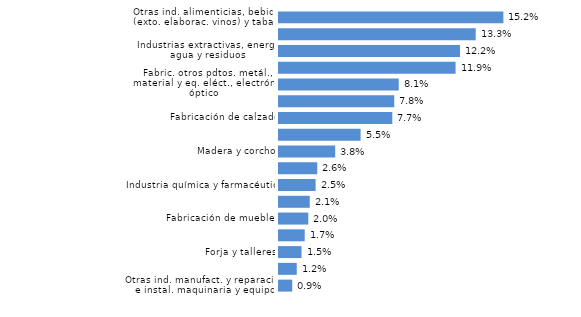
| Category | La Rioja |
|---|---|
| Otras ind. manufact. y reparación e instal. maquinaria y equipo | 0.009 |
| Metalurgia y fabricación de elementos metálicos para la construcción | 0.012 |
| Forja y talleres | 0.015 |
| Ind. textil, confección, cuero, marroquinería y viaje | 0.017 |
| Fabricación de muebles | 0.02 |
| Papel, artes gráficas y reproducción de soportes grabados | 0.021 |
| Industria química y farmacéutica | 0.025 |
| Productos minerales no metálicos diversos | 0.026 |
| Madera y corcho | 0.038 |
| Fabricación de maquinaria, equipo y material de transporte | 0.055 |
| Fabricación de calzado | 0.077 |
| Caucho y materias plásticas | 0.078 |
| Fabric. otros pdtos. metál., material y eq. eléct., electrón. y óptico | 0.081 |
| Ind. cárnica, frutas, hortal., aceit. y grasas veget. y anim. e ind. láctea | 0.119 |
| Industrias extractivas, energía, agua y residuos | 0.122 |
| Elaboración de vinos | 0.133 |
| Otras ind. alimenticias, bebidas (exto. elaborac. vinos) y tabaco | 0.152 |